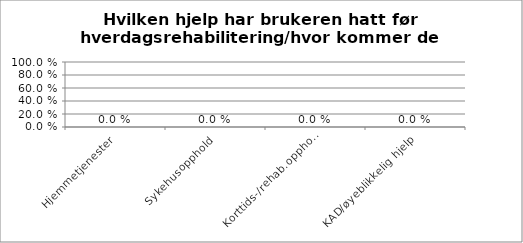
| Category | Prosent |
|---|---|
| Hjemmetjenester | 0 |
| Sykehusopphold | 0 |
| Korttids-/rehab.opphold | 0 |
| KAD/øyeblikkelig hjelp | 0 |